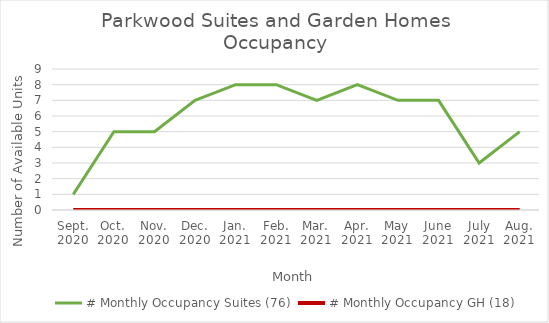
| Category | # Monthly Occupancy Suites (76) | # Monthly Occupancy GH (18) |
|---|---|---|
| Sept.
2020 | 1 | 0 |
| Oct.
2020 | 5 | 0 |
| Nov.
2020 | 5 | 0 |
| Dec.
2020 | 7 | 0 |
| Jan.
2021 | 8 | 0 |
| Feb.
2021 | 8 | 0 |
| Mar.
2021 | 7 | 0 |
| Apr.
2021 | 8 | 0 |
| May
2021 | 7 | 0 |
| June
2021 | 7 | 0 |
| July
2021 | 3 | 0 |
| Aug.
2021 | 5 | 0 |